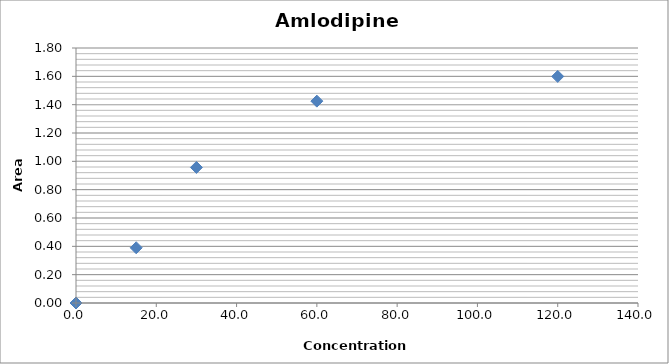
| Category | Series 0 |
|---|---|
| 0.0 | 0 |
| 15.0 | 0.39 |
| 30.0 | 0.957 |
| 60.0 | 1.425 |
| 120.0 | 1.599 |